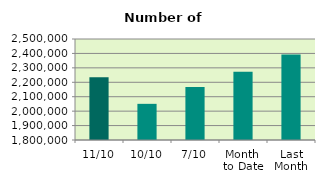
| Category | Series 0 |
|---|---|
| 11/10 | 2234868 |
| 10/10 | 2050612 |
| 7/10 | 2167936 |
| Month 
to Date | 2273148.857 |
| Last
Month | 2392468.182 |